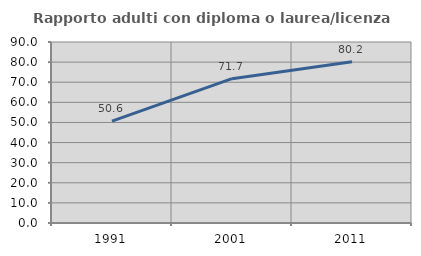
| Category | Rapporto adulti con diploma o laurea/licenza media  |
|---|---|
| 1991.0 | 50.641 |
| 2001.0 | 71.749 |
| 2011.0 | 80.176 |